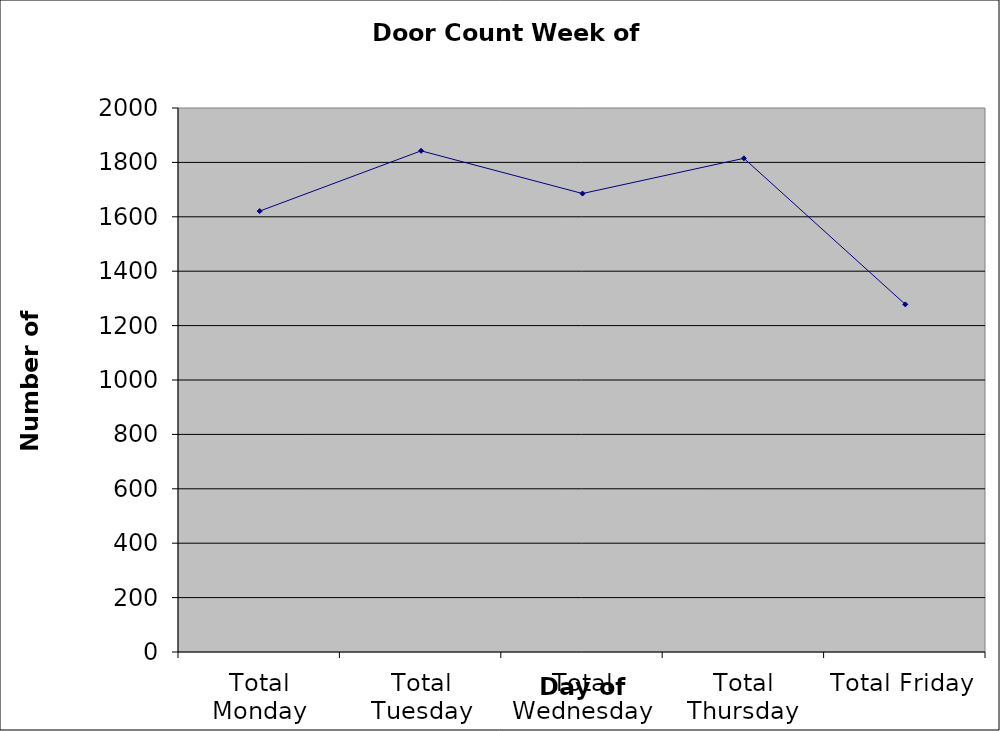
| Category | Series 0 |
|---|---|
| Total Monday | 1621 |
| Total Tuesday | 1842.5 |
| Total Wednesday | 1685.5 |
| Total Thursday | 1815 |
| Total Friday | 1278 |